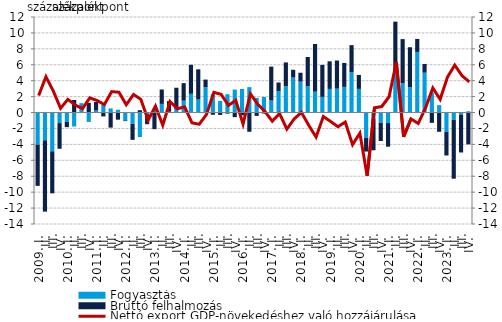
| Category | Fogyasztás | Bruttó felhalmozás |
|---|---|---|
| 2009. I. | -4.032 | -5.18 |
|          II. | -3.484 | -8.963 |
|          III. | -4.871 | -5.275 |
|          IV. | -1.326 | -3.221 |
| 2010. I. | -1.191 | -0.647 |
|          II. | -1.753 | 1.575 |
|          III. | 1.179 | -0.011 |
|          IV. | -1.177 | 1.219 |
| 2011. I. | 0.252 | 1.073 |
|          II. | 0.955 | -0.488 |
|          III. | 0.522 | -1.893 |
|          IV. | 0.354 | -0.897 |
| 2012. I. | -0.992 | -0.085 |
|          II. | -1.436 | -1.996 |
|          III. | -3.081 | 0.294 |
|          IV. | -0.215 | -1.252 |
| 2013. I. | 0.412 | -2.088 |
| II. | 1.086 | 1.81 |
|          III. | 0.103 | 1.333 |
| IV. | 0.455 | 2.66 |
| 2014. I. | 1.489 | 2.202 |
| II. | 2.351 | 3.647 |
|          III. | 1.636 | 3.793 |
| IV. | 3.2 | 0.941 |
| 2015. I. | 2.32 | -0.28 |
| II. | 1.459 | -0.298 |
|          III. | 2.298 | -0.134 |
| IV. | 2.886 | -0.579 |
| 2016. I. | 2.955 | -0.349 |
| II. | 3.19 | -2.415 |
|          III. | 1.848 | -0.419 |
| IV. | 1.95 | -0.125 |
| 2017. I. | 1.51 | 4.256 |
| II. | 2.697 | 1.075 |
|          III. | 3.3 | 2.996 |
| IV. | 4.397 | 0.973 |
| 2018. I. | 3.881 | 1.117 |
| II. | 3.295 | 3.68 |
|          III. | 2.62 | 5.992 |
| IV. | 1.967 | 4.02 |
| 2019. I. | 2.965 | 3.47 |
| II. | 3 | 3.534 |
|          III. | 3.22 | 3.008 |
| IV. | 5.053 | 3.414 |
| 2020. I. | 2.971 | 1.751 |
| II. | -3.175 | -1.726 |
|          III. | -0.822 | -3.919 |
| IV. | -1.272 | -2.303 |
| 2021. I. | -1.322 | -2.968 |
| II. | 5.248 | 6.165 |
|          III. | 3.683 | 5.54 |
| IV. | 3.194 | 5.009 |
| 2022. I. | 7.61 | 1.632 |
| II. | 5.005 | 1.099 |
|          III. | 2.525 | -1.295 |
| IV. | 0.928 | -2.415 |
| 2023. I. | -2.434 | -2.962 |
| II. | -0.931 | -7.38 |
|          III. | -0.255 | -4.762 |
| IV. | 0.166 | -3.996 |